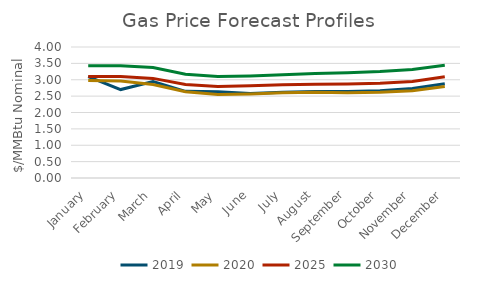
| Category | 2019 | 2020 | 2025 | 2030 |
|---|---|---|---|---|
| January | 3.094 | 2.978 | 3.099 | 3.43 |
| February | 2.7 | 2.962 | 3.1 | 3.431 |
| March | 2.943 | 2.857 | 3.041 | 3.372 |
| April | 2.647 | 2.635 | 2.857 | 3.168 |
| May | 2.631 | 2.55 | 2.794 | 3.097 |
| June | 2.581 | 2.567 | 2.813 | 3.116 |
| July | 2.616 | 2.6 | 2.845 | 3.154 |
| August | 2.642 | 2.615 | 2.866 | 3.194 |
| September | 2.645 | 2.605 | 2.872 | 3.213 |
| October | 2.667 | 2.619 | 2.891 | 3.249 |
| November | 2.732 | 2.664 | 2.947 | 3.31 |
| December | 2.875 | 2.796 | 3.09 | 3.441 |